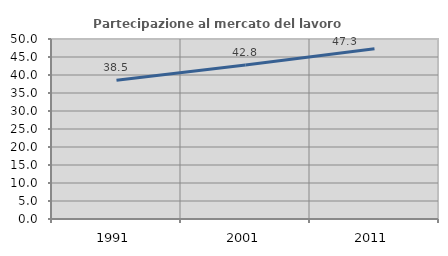
| Category | Partecipazione al mercato del lavoro  femminile |
|---|---|
| 1991.0 | 38.547 |
| 2001.0 | 42.783 |
| 2011.0 | 47.284 |